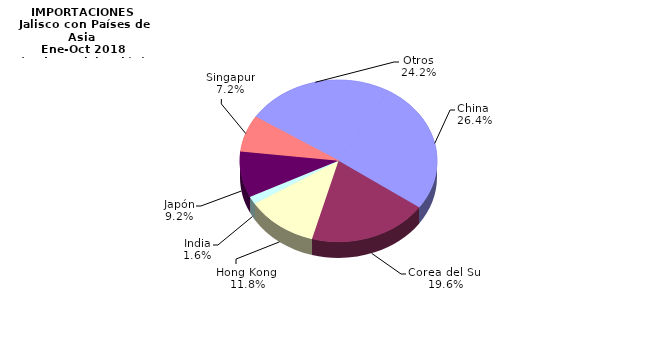
| Category | Series 0 |
|---|---|
| China  | 3392.735 |
| Corea del Sur | 2510.621 |
| Hong Kong  | 1514.677 |
| India | 199.984 |
| Japón | 1177.404 |
| Singapur | 928.759 |
| Otros | 3111.17 |